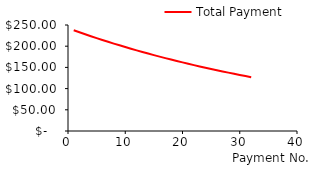
| Category | Total Payment |
|---|---|
| 1.0 | 237.5 |
| 2.0 | 232.75 |
| 3.0 | 228.095 |
| 4.0 | 223.533 |
| 5.0 | 219.062 |
| 6.0 | 214.681 |
| 7.0 | 210.388 |
| 8.0 | 206.18 |
| 9.0 | 202.056 |
| 10.0 | 198.015 |
| 11.0 | 194.055 |
| 12.0 | 190.174 |
| 13.0 | 186.37 |
| 14.0 | 182.643 |
| 15.0 | 178.99 |
| 16.0 | 175.41 |
| 17.0 | 171.902 |
| 18.0 | 168.464 |
| 19.0 | 165.095 |
| 20.0 | 161.793 |
| 21.0 | 158.557 |
| 22.0 | 155.386 |
| 23.0 | 152.278 |
| 24.0 | 149.232 |
| 25.0 | 146.248 |
| 26.0 | 143.323 |
| 27.0 | 140.456 |
| 28.0 | 137.647 |
| 29.0 | 134.894 |
| 30.0 | 132.196 |
| 31.0 | 129.553 |
| 32.0 | 126.961 |